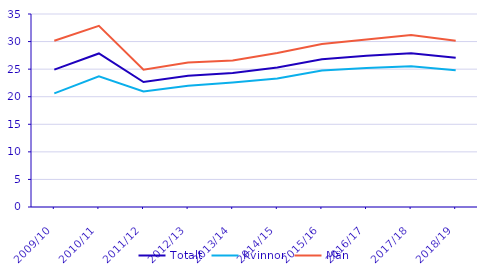
| Category | Totalt | Kvinnor | Män |
|---|---|---|---|
| 2009/10 | 24.91 | 20.601 | 30.156 |
| 2010/11 | 27.846 | 23.706 | 32.854 |
| 2011/12 | 22.657 | 20.936 | 24.885 |
| 2012/13 | 23.806 | 22.005 | 26.19 |
| 2013/14 | 24.322 | 22.598 | 26.588 |
| 2014/15 | 25.301 | 23.289 | 27.942 |
| 2015/16 | 26.808 | 24.748 | 29.544 |
| 2016/17 | 27.407 | 25.222 | 30.356 |
| 2017/18 | 27.903 | 25.526 | 31.176 |
| 2018/19 | 27.068 | 24.818 | 30.161 |